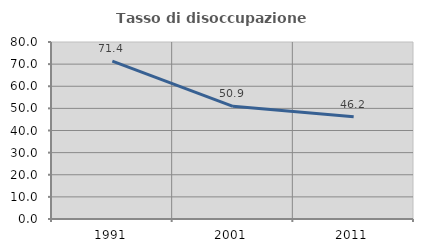
| Category | Tasso di disoccupazione giovanile  |
|---|---|
| 1991.0 | 71.398 |
| 2001.0 | 50.92 |
| 2011.0 | 46.237 |